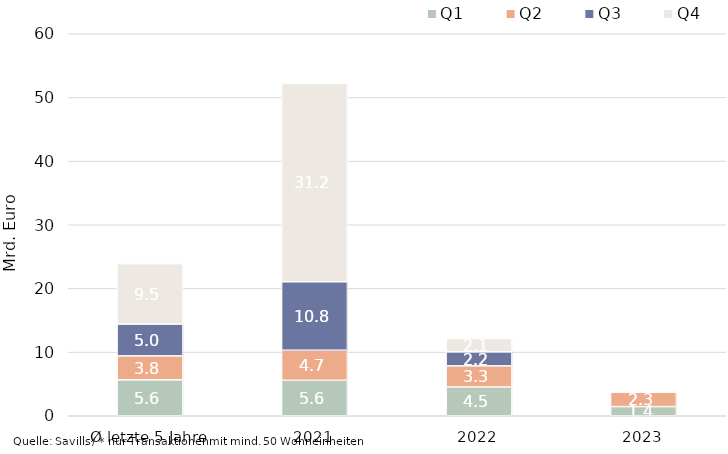
| Category | Q1 | Q2 | Q3 | Q4 |
|---|---|---|---|---|
| Ø letzte 5 Jahre | 5646017558.366 | 3761292096.308 | 4997300272.744 | 9491257788.076 |
| 2021 | 5569888758 | 4721007645 | 10751893445.75 | 31156264639.5 |
| 2022 | 4520214286.54 | 3321253136 | 2192659976.13 | 2082641060 |
| 2023 | 1439417056.98 | 2257534495.42 | 0 | 0 |